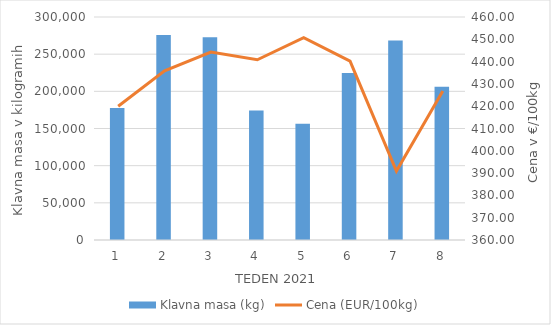
| Category | Klavna masa (kg) |
|---|---|
| 1.0 | 177573 |
| 2.0 | 275951 |
| 3.0 | 272797 |
| 4.0 | 174056 |
| 5.0 | 156508 |
| 6.0 | 224595 |
| 7.0 | 268436 |
| 8.0 | 206193 |